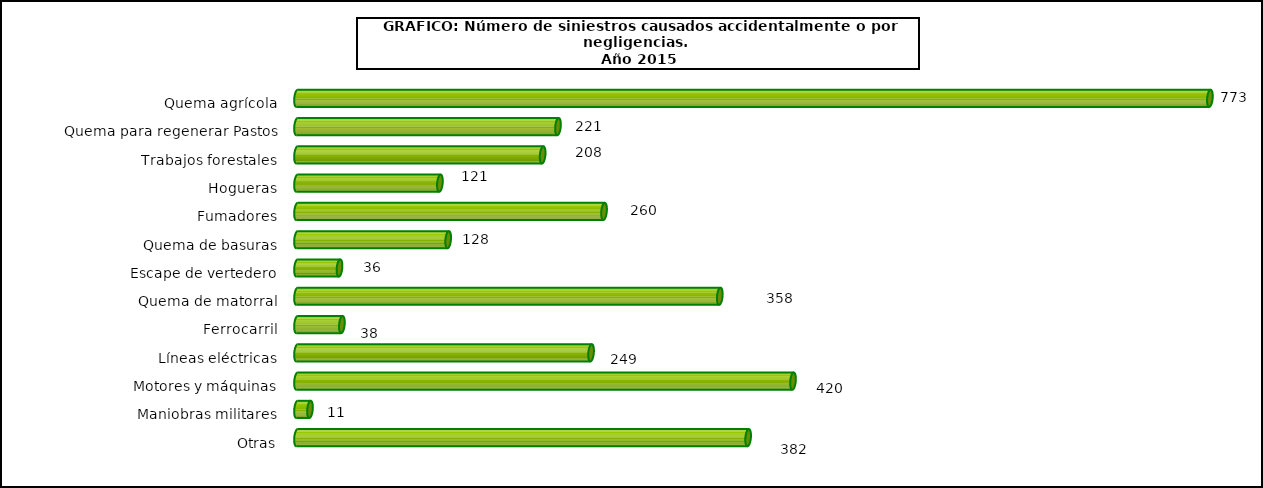
| Category | neglicencias |
|---|---|
| Quema agrícola | 773 |
| Quema para regenerar Pastos | 221 |
| Trabajos forestales | 208 |
| Hogueras | 121 |
| Fumadores | 260 |
| Quema de basuras | 128 |
| Escape de vertedero | 36 |
| Quema de matorral | 358 |
| Ferrocarril | 38 |
| Líneas eléctricas | 249 |
| Motores y máquinas | 420 |
| Maniobras militares | 11 |
| Otras | 382 |